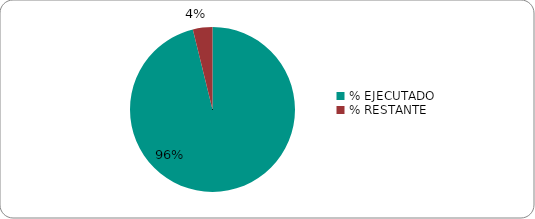
| Category | Series 0 |
|---|---|
| % EJECUTADO | 0.962 |
| % RESTANTE | 0.038 |